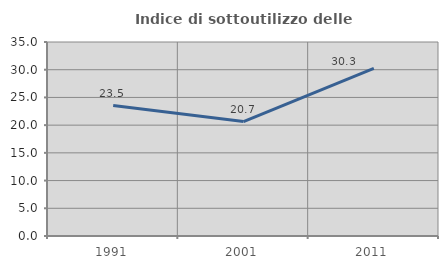
| Category | Indice di sottoutilizzo delle abitazioni  |
|---|---|
| 1991.0 | 23.529 |
| 2001.0 | 20.652 |
| 2011.0 | 30.25 |